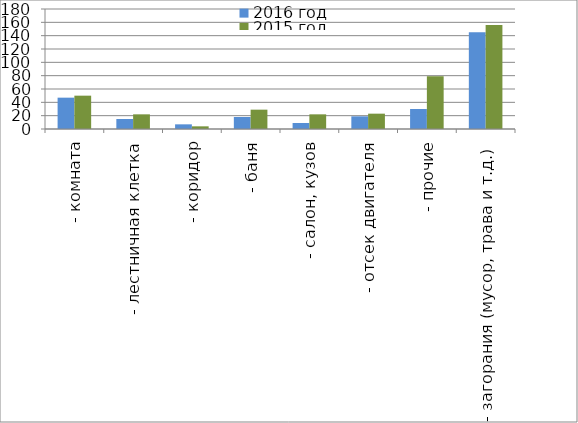
| Category | 2016 год | 2015 год |
|---|---|---|
|  - комната | 47 | 50 |
|  - лестничная клетка | 15 | 22 |
|  - коридор | 7 | 4 |
|  - баня | 18 | 29 |
|  - салон, кузов | 9 | 22 |
|  - отсек двигателя | 19 | 23 |
| - прочие | 30 | 79 |
| - загорания (мусор, трава и т.д.)  | 145 | 156 |